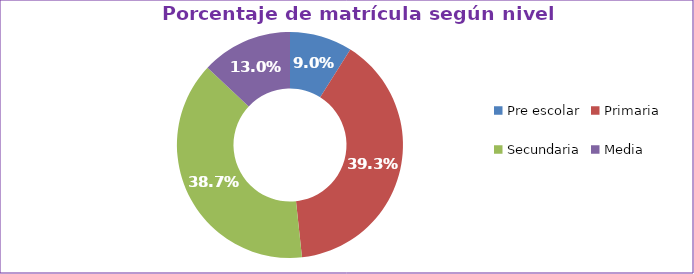
| Category | Series 0 |
|---|---|
| Pre escolar | 0.09 |
| Primaria | 0.393 |
| Secundaria | 0.387 |
| Media | 0.13 |